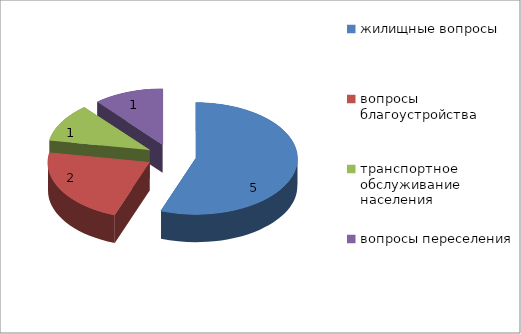
| Category | Series 0 |
|---|---|
| жилищные вопросы | 5 |
| вопросы благоустройства | 2 |
| транспортное обслуживание населения | 1 |
| вопросы переселения | 1 |